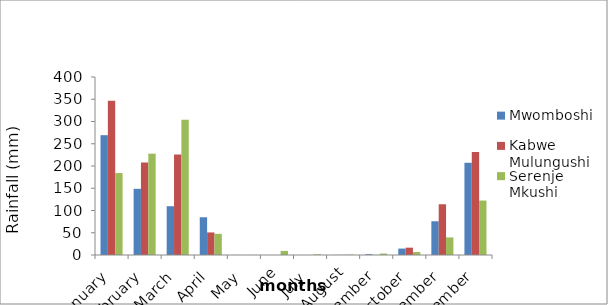
| Category | Mwomboshi | Kabwe Mulungushi | Serenje Mkushi |
|---|---|---|---|
| January | 269.275 | 346.475 | 184.125 |
| february | 148.7 | 207.85 | 227.725 |
| March | 109.65 | 225.85 | 304.15 |
| April | 84.8 | 50.7 | 47.55 |
| May | 0.15 | 0 | 0.1 |
| June | 0 | 0 | 9.15 |
| July | 0 | 0 | 1.5 |
| August | 0.2 | 0.3 | 0.8 |
| September | 1.95 | 0.15 | 3.2 |
| October | 14.4 | 16.489 | 6.64 |
| November | 75.84 | 114.066 | 39.48 |
| December | 207.24 | 231.312 | 122.36 |